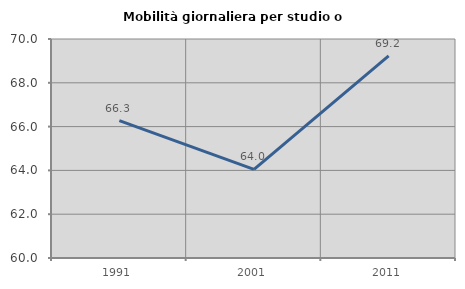
| Category | Mobilità giornaliera per studio o lavoro |
|---|---|
| 1991.0 | 66.276 |
| 2001.0 | 64.043 |
| 2011.0 | 69.233 |